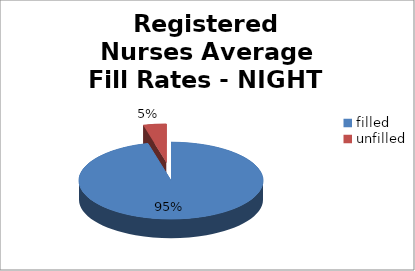
| Category | Series 0 |
|---|---|
| filled  | 95 |
| unfilled | 4 |